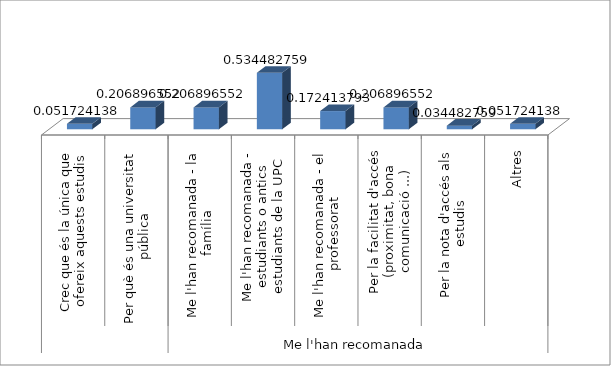
| Category | Grau en Estudis d'Arquitectura |
|---|---|
| 0 | 0.052 |
| 1 | 0.207 |
| 2 | 0.207 |
| 3 | 0.534 |
| 4 | 0.172 |
| 5 | 0.207 |
| 6 | 0.034 |
| 7 | 0.052 |